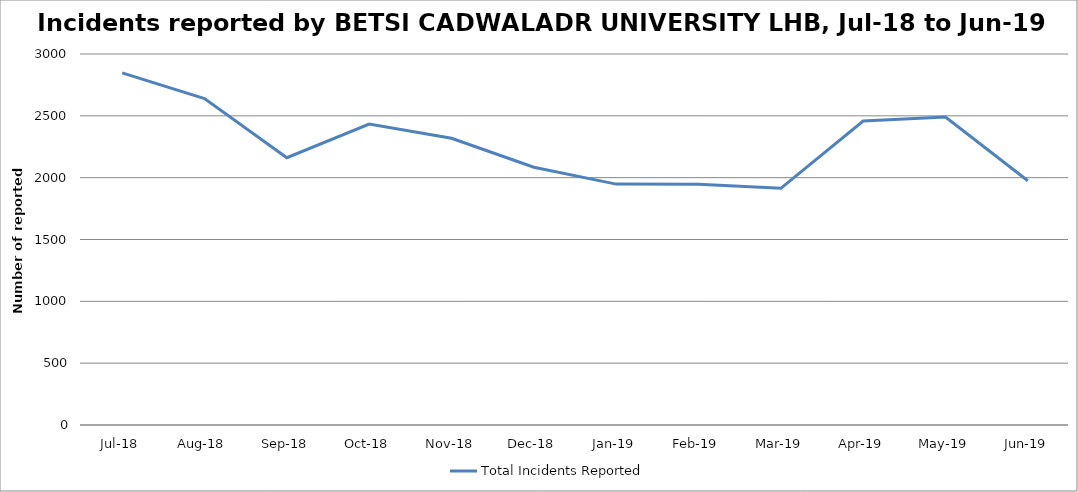
| Category | Total Incidents Reported |
|---|---|
| Jul-18 | 2847 |
| Aug-18 | 2640 |
| Sep-18 | 2161 |
| Oct-18 | 2434 |
| Nov-18 | 2319 |
| Dec-18 | 2084 |
| Jan-19 | 1948 |
| Feb-19 | 1947 |
| Mar-19 | 1914 |
| Apr-19 | 2458 |
| May-19 | 2490 |
| Jun-19 | 1975 |